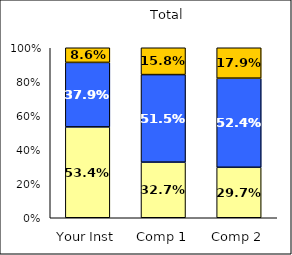
| Category | Low Job Satisfaction: Compensation | Average Job Satisfaction: Compensation | High Job Satisfaction: Compensation |
|---|---|---|---|
| Your Inst | 0.534 | 0.379 | 0.086 |
| Comp 1 | 0.327 | 0.515 | 0.158 |
| Comp 2 | 0.297 | 0.524 | 0.179 |